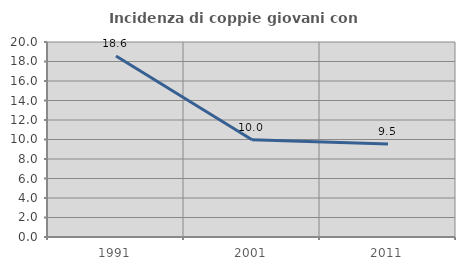
| Category | Incidenza di coppie giovani con figli |
|---|---|
| 1991.0 | 18.56 |
| 2001.0 | 9.974 |
| 2011.0 | 9.527 |